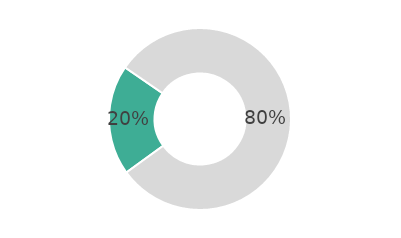
| Category | Series 0 |
|---|---|
| 0 | 19.592 |
| 1 | 80.408 |